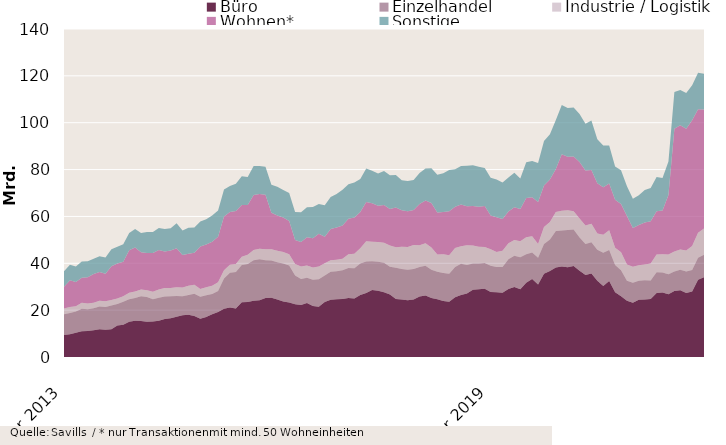
| Category | Büro | Einzelhandel | Industrie / Logistik | Wohnen* | Sonstige |
|---|---|---|---|---|---|
| 2013-03-01 | 9382899317.14 | 8879175776.35 | 2448956640.7 | 9229456528.32 | 6668642236.18 |
| 2013-04-01 | 9737865550.14 | 9085115744.35 | 2505676640.7 | 11400620541.32 | 6675635417.18 |
| 2013-05-01 | 10330473308.14 | 9039419099.35 | 2286696652.7 | 10308183683.48 | 6691277053.18 |
| 2013-06-01 | 10978757530.14 | 9577681151.78 | 2561696079.7 | 10738835935.44 | 6889015860.68 |
| 2013-07-01 | 11142986962.92 | 9286443584.78 | 2380046000.7 | 11240541620.44 | 6860571232.45 |
| 2013-08-01 | 11443046924.92 | 9376730772.8 | 2332457290 | 12229839822.44 | 6523458565.93 |
| 2013-09-01 | 11813118125.72 | 9699402869.51 | 2519207211.98 | 12284101856.74 | 6702053323.89 |
| 2013-10-01 | 11609579110.72 | 9727861863.57 | 2441069185.98 | 11727008984.54 | 6999037430.89 |
| 2013-11-01 | 11823434614.72 | 10122530032.36 | 2430937190.98 | 14361489005.63 | 7242529719.86 |
| 2013-12-01 | 13486314866.72 | 9187102030.91 | 2347240569.98 | 14839189260.74 | 7207107913.45 |
| 2014-01-01 | 13780730877.72 | 9851068493.92 | 2318485717.98 | 14690274441.74 | 7445499336.45 |
| 2014-02-01 | 15007305331.22 | 9673463303.24 | 2768349976.98 | 18105536458.24 | 7410903668.17 |
| 2014-03-01 | 15491487872.58 | 9654351125.74 | 2833117356.98 | 18788331922.24 | 7865305632.17 |
| 2014-04-01 | 15374141977.58 | 10607660669.74 | 2834100536.98 | 15912594110.24 | 8156058838.17 |
| 2014-05-01 | 15060894833.58 | 10546963482.24 | 2845864408.98 | 15985891426.24 | 8912269938.17 |
| 2014-06-01 | 15158218425.66 | 9544432647.24 | 3105506584.98 | 16600111315.18 | 8957481288.38 |
| 2014-07-01 | 15478732963.88 | 9841966235.24 | 3440852401.98 | 16949735532.68 | 9348736034.61 |
| 2014-08-01 | 16232650242.88 | 9636967715.24 | 3573059549.98 | 15601635374.68 | 9537173270.13 |
| 2014-09-01 | 16583059928.08 | 9353804856.84 | 3506391505.5 | 15963260713.68 | 9536363131.17 |
| 2014-10-01 | 17213987967.08 | 8866837530.84 | 3656699955.5 | 16628034819.88 | 10688452074.17 |
| 2014-11-01 | 17844374967.08 | 8117398128.05 | 3665328905.5 | 13878849559.89 | 10536862158.2 |
| 2014-12-01 | 18081725689.74 | 8390279963.03 | 3920968980.31 | 13670541413.41 | 11111775796.81 |
| 2015-01-01 | 17480642203.74 | 9466254593.03 | 3883908572.31 | 13646785050.41 | 10792640236.82 |
| 2015-02-01 | 16274240230.74 | 9403790983.81 | 3308490268.73 | 18150436996.91 | 10711659377.05 |
| 2015-03-01 | 17035308030.53 | 9365302106.81 | 3368654245.73 | 18257100941.91 | 10814665093.98 |
| 2015-04-01 | 18258922782.53 | 8632001669.81 | 3468694360.68 | 18830450268.91 | 11160418925.98 |
| 2015-05-01 | 19244040473.45 | 8968092469.31 | 3728635607.68 | 19401993150.91 | 11206086418.98 |
| 2015-06-01 | 20628774084.83 | 12835460483.14 | 3559231021.83 | 22972449786.51 | 11551008084.75 |
| 2015-07-01 | 21112087532.5 | 14845940919.21 | 3371725415.86 | 22540107592.35 | 11120198096.21 |
| 2015-08-01 | 20695261632.5 | 15562941505.21 | 3450767146.86 | 22635118357.35 | 11596269263.21 |
| 2015-09-01 | 23317313452.46 | 16001092585.73 | 3520511283.36 | 22065141963.35 | 12239394888.21 |
| 2015-10-01 | 23516812856.46 | 16181040556.36 | 3919085482.36 | 21292965650.35 | 11947737369.21 |
| 2015-11-01 | 23972463618.14 | 17339041737.5 | 4397719316.13 | 23395398176.29 | 12403799285.38 |
| 2015-12-01 | 24223428696.48 | 17455198961.04 | 4557113724.92 | 23319336016.77 | 11921836396.75 |
| 2016-01-01 | 25174915627.48 | 16138997225.45 | 4662502872.92 | 23277671921.77 | 11967817247.24 |
| 2016-02-01 | 25329929348.53 | 15820090497.99 | 4833139363.87 | 15563498654.77 | 11947811922.01 |
| 2016-03-01 | 24570059201.74 | 15865699828.72 | 4877967507.07 | 15108592339.77 | 12258738527.08 |
| 2016-04-01 | 23703143104.74 | 16254770286.07 | 4833846127.82 | 14760671477.37 | 11696815742.08 |
| 2016-05-01 | 23294206506.82 | 15809944380.07 | 4749671116.82 | 14232081715.37 | 11919414936.04 |
| 2016-06-01 | 22501572843.36 | 12232494883.06 | 4999570420.67 | 10189436595.87 | 11965206341.06 |
| 2016-07-01 | 22191433924.69 | 11125435985.56 | 5312245465.64 | 10404072475.53 | 12714721035.96 |
| 2016-08-01 | 23095572073.69 | 10745638868.56 | 5247332254.55 | 12050427222.53 | 12760471635.96 |
| 2016-09-01 | 21794742253.73 | 11145401725.47 | 5270185116.55 | 12465620399.13 | 13320393986.26 |
| 2016-10-01 | 21450269446.86 | 11739208168.84 | 5398267322.55 | 14070034790.02 | 12669133056.83 |
| 2016-11-01 | 23506003086.76 | 11238716740.7 | 5243284144.73 | 11380146617.09 | 13425196679.66 |
| 2016-12-01 | 24468092228.4 | 11930870429.99 | 4886851002.13 | 13331201908.09 | 13681375420.64 |
| 2017-01-01 | 24675768593.4 | 11942263686.96 | 4921244810.37 | 13729696509.09 | 14250866691.58 |
| 2017-02-01 | 24713389622.41 | 12356472437.09 | 4839285725 | 14267858145.09 | 15185668584.58 |
| 2017-03-01 | 25170261511.4 | 12765732178.37 | 5896154543.8 | 15167920484.39 | 14747708325.58 |
| 2017-04-01 | 25008250661.71 | 12830910576.9 | 6258560580.1 | 15489114794.79 | 14851969486.67 |
| 2017-05-01 | 26420856083.47 | 13492885630.15 | 6480202097.1 | 15522287182.8 | 14083438590.28 |
| 2017-06-01 | 27359198504.1 | 13451943478.5 | 8559046401.46 | 16801850396.39 | 14298214208.56 |
| 2017-07-01 | 28566083298.1 | 12300139347.93 | 8320632158.46 | 16480355706.39 | 13778769706.2 |
| 2017-08-01 | 28285172977.1 | 12408029136.93 | 8383195707.55 | 15442529308.39 | 13849134751.2 |
| 2017-09-01 | 27607830483.45 | 12616830917.94 | 8506558041.55 | 16123359085.78 | 14486501554.74 |
| 2017-10-01 | 26661153964.32 | 11909960273.94 | 9044546430.46 | 15580068614.87 | 14351240861.17 |
| 2017-11-01 | 24728535385.17 | 13314421843.83 | 8799447546.51 | 16947694524.87 | 13849490657.44 |
| 2017-12-01 | 24513417630.53 | 13078578236.48 | 9470343512.7 | 15610704960.87 | 12759017527.48 |
| 2018-01-01 | 24219024273.53 | 13013700645.1 | 9721702683.46 | 15307451168.86 | 12872295093.04 |
| 2018-02-01 | 24590947510.47 | 12985537030.65 | 10213193365.46 | 14917009796.86 | 12890336189.04 |
| 2018-03-01 | 25772438266.48 | 12663577036.64 | 9307934893.46 | 17524767231.49 | 13297726597.02 |
| 2018-04-01 | 26239260459.17 | 12722345110.76 | 9605919650.46 | 18204136136.49 | 13654710808.93 |
| 2018-05-01 | 25176840173.41 | 12092663746.51 | 9488564046.46 | 19015064846.48 | 14830516074.36 |
| 2018-06-01 | 24619805985.78 | 11810463263.34 | 7330050155.1 | 17955943579.56 | 16022655962.08 |
| 2018-07-01 | 23897232823.78 | 11960863126.32 | 7966869588.1 | 18082211683.56 | 16514108766.19 |
| 2018-08-01 | 23631217227.76 | 11885701905.19 | 7898300709.1 | 18779877058.41 | 17667527641.04 |
| 2018-09-01 | 25478200690.41 | 12927853979.55 | 8136141438.1 | 17594307591.42 | 15998426541.21 |
| 2018-10-01 | 26428322940.41 | 13398765782.82 | 7412735586.25 | 17806279798.32 | 16500489800.21 |
| 2018-11-01 | 27102721403.45 | 12145908934.88 | 8401198728.54 | 16739676352.32 | 17199430194.25 |
| 2018-12-01 | 28655175031.45 | 11248285254.68 | 7673095490.35 | 16903534102.32 | 17410832515.26 |
| 2019-01-01 | 28881677192.45 | 10984616615.68 | 7220623719.35 | 17089851283.2 | 17011641609.26 |
| 2019-02-01 | 29153984861.45 | 10992187442.4 | 6837562259.96 | 17443099230.2 | 16288670799.62 |
| 2019-03-01 | 27779834171.45 | 11171202657.26 | 6991519187.16 | 14403850111.27 | 16138588186.64 |
| 2019-04-01 | 27660063728.31 | 10721779269.12 | 6440787186.06 | 14819462716.14 | 16122027674.89 |
| 2019-05-01 | 27411606224.31 | 11007377577.12 | 6930931752.06 | 13546461129.14 | 15591702370.89 |
| 2019-06-01 | 28981375466.82 | 12738169920.09 | 6808322697.06 | 13582021303.47 | 14498193682.96 |
| 2019-07-01 | 29836478466.29 | 13385300761.26 | 6721738121.06 | 13965040868.47 | 14698594837.92 |
| 2019-08-01 | 28932944882.31 | 13638029313.39 | 6847156982.06 | 13700485358.62 | 13056753149.07 |
| 2019-09-01 | 31740495687.25 | 12091023494.97 | 7236155171.92 | 16808223801.62 | 15208053471.17 |
| 2019-10-01 | 33266807249.25 | 11371608887.7 | 6870917898.86 | 16650274404.74 | 15543023722.17 |
| 2019-11-01 | 30998345096.78 | 11335647756.75 | 5862593126.57 | 17999098699.74 | 16608257247.86 |
| 2019-12-01 | 35527691128.49 | 12748435551.88 | 7193076149.23 | 17715667348.74 | 18988776442.82 |
| 2020-01-01 | 36701466860.49 | 13455205119.88 | 7418333450.23 | 18152920102.87 | 19298443060.82 |
| 2020-02-01 | 38253570613.44 | 15518583828.37 | 8118849336.38 | 18347811221.37 | 20876955510.54 |
| 2020-03-01 | 38661114818.89 | 15361758647.15 | 8435638262.18 | 24034093487.37 | 21087830921.12 |
| 2020-04-01 | 38306762938.03 | 15876632879.17 | 8421581433.28 | 22892151936.5 | 20818918971.87 |
| 2020-05-01 | 38874029574.03 | 15517202993.17 | 7833704033.28 | 23320141777.5 | 20907392846.83 |
| 2020-06-01 | 36825932126.52 | 14166673820.21 | 8153642308.28 | 24041398462.5 | 20572849639.76 |
| 2020-07-01 | 35038901674.05 | 13206002556.06 | 7858106953.28 | 23454894941.5 | 20046619490.06 |
| 2020-08-01 | 35631965111.05 | 13340195992.06 | 7864692000.28 | 22961788157.5 | 21150990421.55 |
| 2020-09-01 | 32515990383.11 | 13251359673.68 | 6961195944.42 | 21430453702.49 | 18831855953.08 |
| 2020-10-01 | 30357242112.11 | 14173883253.68 | 7625238129.42 | 20314229725.49 | 17841894371.54 |
| 2020-11-01 | 32387193464.11 | 13264654126.68 | 8422802908.42 | 20031748385.49 | 16141331591.98 |
| 2020-12-01 | 27661146779.4 | 11619042101.74 | 7340810853.76 | 20448638435.49 | 14201491952.88 |
| 2021-01-01 | 25978755162.4 | 11039497747.74 | 7676907719.76 | 20652659315.49 | 14332310879.79 |
| 2021-02-01 | 23996936055.45 | 8570163915.53 | 6938860723 | 20660784697.99 | 12691501255.47 |
| 2021-03-01 | 23196412137 | 8486914457.89 | 6789691146.99 | 16596692848.99 | 12452530480.25 |
| 2021-04-01 | 24453392320 | 8077653506.01 | 6669014867.99 | 17144667013.99 | 12679964254.25 |
| 2021-05-01 | 24593933088 | 8205436491.01 | 6688135128.99 | 17908984016.99 | 13895802709.29 |
| 2021-06-01 | 24732396945 | 7883145938 | 7330984208.99 | 17975040212.99 | 14206833508.91 |
| 2021-07-01 | 27303333580 | 8852856187 | 7562676605.99 | 18534669487.74 | 14615930910.54 |
| 2021-08-01 | 27573905655 | 8481290112 | 7850085331.96 | 18650239563.74 | 13870941223.05 |
| 2021-09-01 | 26778683918 | 8553667780.91 | 8421743830.96 | 25378180018.75 | 14293773303.41 |
| 2021-10-01 | 28175597365.69 | 8265460390.91 | 8613080520.96 | 52349288139.75 | 15731241646.32 |
| 2021-11-01 | 28459393963.69 | 8783342566.91 | 8675090834.96 | 52964740980.75 | 15126402688.88 |
| 2021-12-01 | 27307850672.69 | 9135901841.07 | 9015197684.96 | 51940174280.25 | 15327302394.02 |
| 2022-01-01 | 27966578909.69 | 9150085506.07 | 10312587571.97 | 53578641431.25 | 14977495944.11 |
| 2022-02-01 | 32962212557.24 | 9423928851.13 | 10606907643.97 | 52742367288.79 | 15582424312.21 |
| 2022-03-01 | 34039557194.27 | 9635595726.43 | 11213180614.93 | 50736091722.79 | 15304475484.52 |